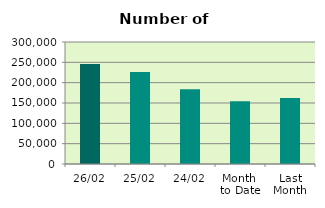
| Category | Series 0 |
|---|---|
| 26/02 | 245986 |
| 25/02 | 226496 |
| 24/02 | 183832 |
| Month 
to Date | 154356.5 |
| Last
Month | 162275.9 |